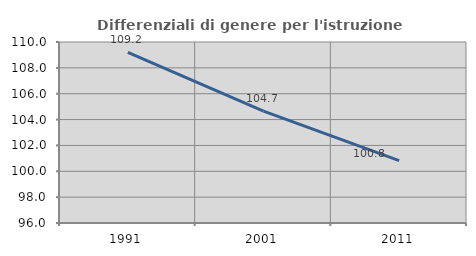
| Category | Differenziali di genere per l'istruzione superiore |
|---|---|
| 1991.0 | 109.195 |
| 2001.0 | 104.659 |
| 2011.0 | 100.823 |